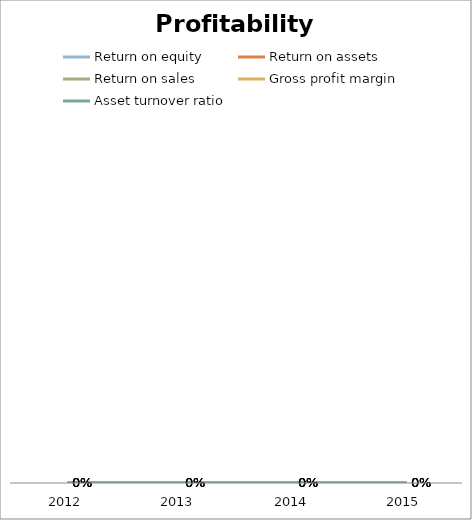
| Category | Return on equity | Return on assets | Return on sales | Gross profit margin | Asset turnover ratio |
|---|---|---|---|---|---|
| 2012.0 | 0 | 0 | 0 | 0 | 0 |
| 2013.0 | 0 | 0 | 0 | 0 | 0 |
| 2014.0 | 0 | 0 | 0 | 0 | 0 |
| 2015.0 | 0 | 0 | 0 | 0 | 0 |